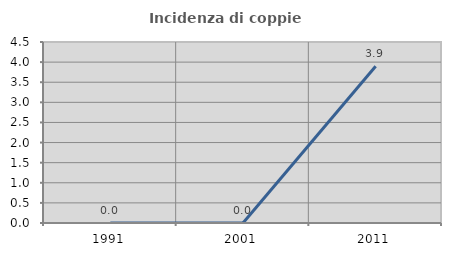
| Category | Incidenza di coppie miste |
|---|---|
| 1991.0 | 0 |
| 2001.0 | 0 |
| 2011.0 | 3.896 |